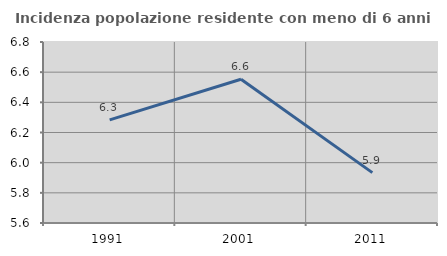
| Category | Incidenza popolazione residente con meno di 6 anni |
|---|---|
| 1991.0 | 6.284 |
| 2001.0 | 6.553 |
| 2011.0 | 5.934 |